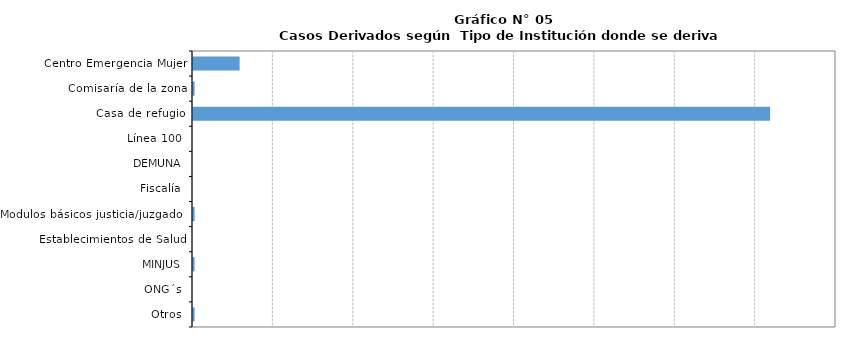
| Category | Series 0 |
|---|---|
| Centro Emergencia Mujer | 29 |
| Comisaría de la zona | 1 |
| Casa de refugio | 359 |
| Línea 100 | 0 |
| DEMUNA | 0 |
| Fiscalía | 0 |
| Modulos básicos justicia/juzgados | 1 |
| Establecimientos de Salud | 0 |
| MINJUS | 1 |
| ONG´s | 0 |
| Otros | 1 |